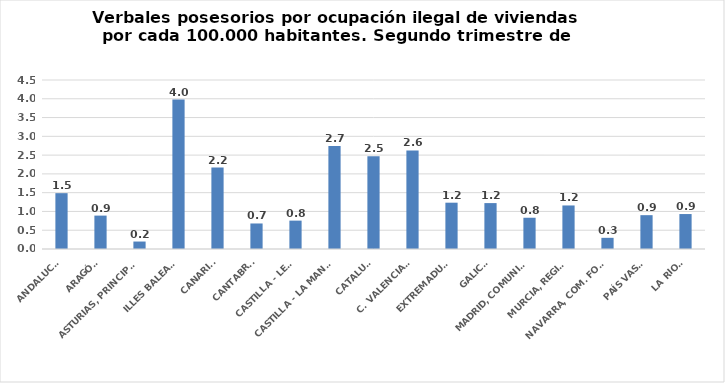
| Category | Series 0 |
|---|---|
| ANDALUCÍA | 1.487 |
| ARAGÓN | 0.889 |
| ASTURIAS, PRINCIPADO | 0.199 |
| ILLES BALEARS | 3.978 |
| CANARIAS | 2.169 |
| CANTABRIA | 0.68 |
| CASTILLA - LEÓN | 0.755 |
| CASTILLA - LA MANCHA | 2.74 |
| CATALUÑA | 2.469 |
| C. VALENCIANA | 2.625 |
| EXTREMADURA | 1.233 |
| GALICIA | 1.222 |
| MADRID, COMUNIDAD | 0.832 |
| MURCIA, REGIÓN | 1.159 |
| NAVARRA, COM. FORAL | 0.298 |
| PAÍS VASCO | 0.901 |
| LA RIOJA | 0.931 |